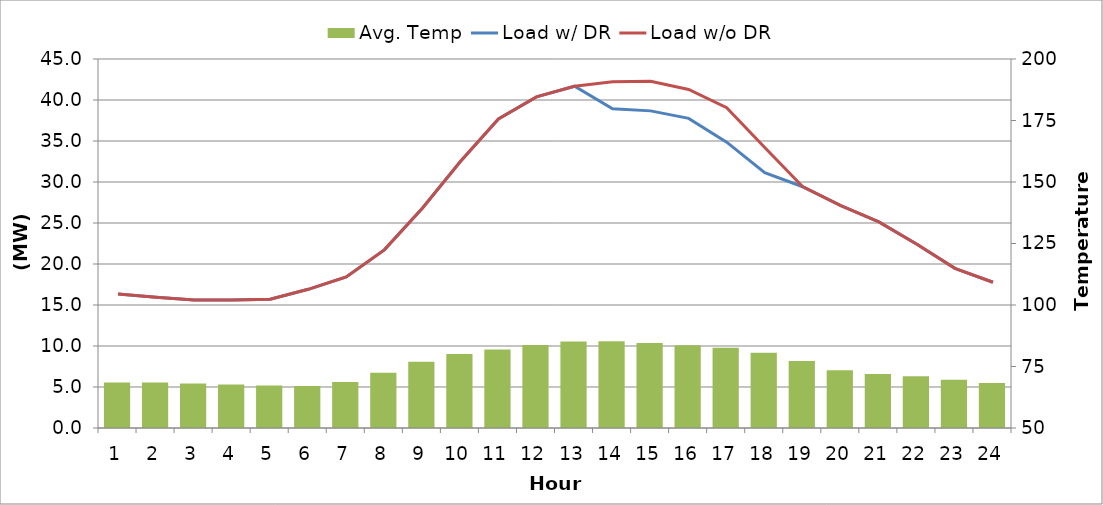
| Category | Avg. Temp |
|---|---|
| 0 | 68.501 |
| 1 | 68.506 |
| 2 | 68.117 |
| 3 | 67.723 |
| 4 | 67.32 |
| 5 | 67.037 |
| 6 | 68.698 |
| 7 | 72.413 |
| 8 | 76.981 |
| 9 | 80.054 |
| 10 | 81.943 |
| 11 | 83.777 |
| 12 | 85.18 |
| 13 | 85.238 |
| 14 | 84.506 |
| 15 | 83.643 |
| 16 | 82.61 |
| 17 | 80.56 |
| 18 | 77.193 |
| 19 | 73.5 |
| 20 | 71.918 |
| 21 | 71.054 |
| 22 | 69.595 |
| 23 | 68.339 |